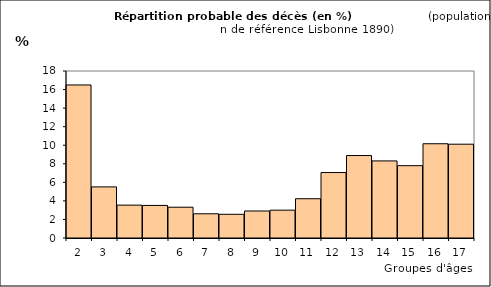
| Category | Series 0 |
|---|---|
| 2.0 | 16.496 |
| 3.0 | 5.509 |
| 4.0 | 3.542 |
| 5.0 | 3.511 |
| 6.0 | 3.319 |
| 7.0 | 2.609 |
| 8.0 | 2.554 |
| 9.0 | 2.91 |
| 10.0 | 3 |
| 11.0 | 4.233 |
| 12.0 | 7.055 |
| 13.0 | 8.888 |
| 14.0 | 8.308 |
| 15.0 | 7.796 |
| 16.0 | 10.16 |
| 17.0 | 10.11 |